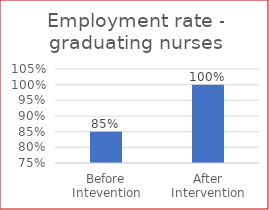
| Category | Employment rate - graduating nurses |
|---|---|
| Before Intevention | 0.85 |
| After Intervention | 1 |